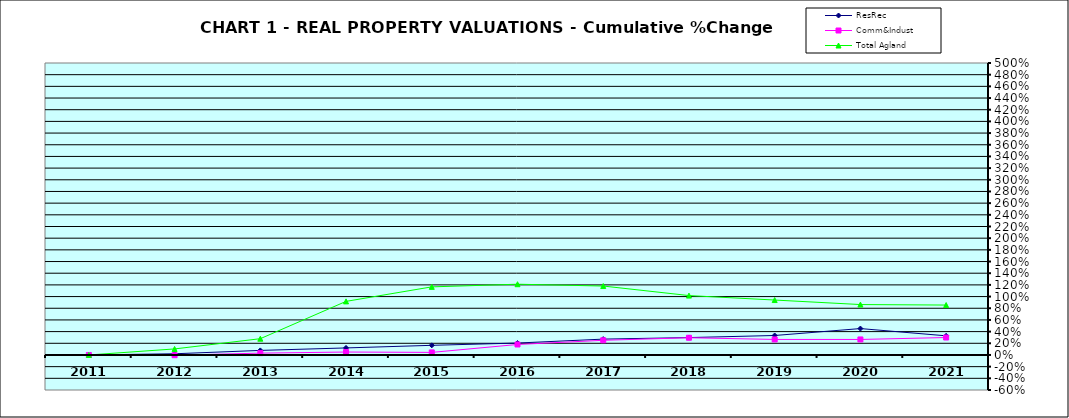
| Category | ResRec | Comm&Indust | Total Agland |
|---|---|---|---|
| 2011.0 | 0 | 0 | 0 |
| 2012.0 | 0.02 | -0.004 | 0.103 |
| 2013.0 | 0.078 | 0.031 | 0.279 |
| 2014.0 | 0.12 | 0.05 | 0.918 |
| 2015.0 | 0.165 | 0.044 | 1.166 |
| 2016.0 | 0.204 | 0.179 | 1.212 |
| 2017.0 | 0.271 | 0.251 | 1.18 |
| 2018.0 | 0.298 | 0.295 | 1.017 |
| 2019.0 | 0.333 | 0.266 | 0.941 |
| 2020.0 | 0.452 | 0.266 | 0.863 |
| 2021.0 | 0.328 | 0.299 | 0.855 |